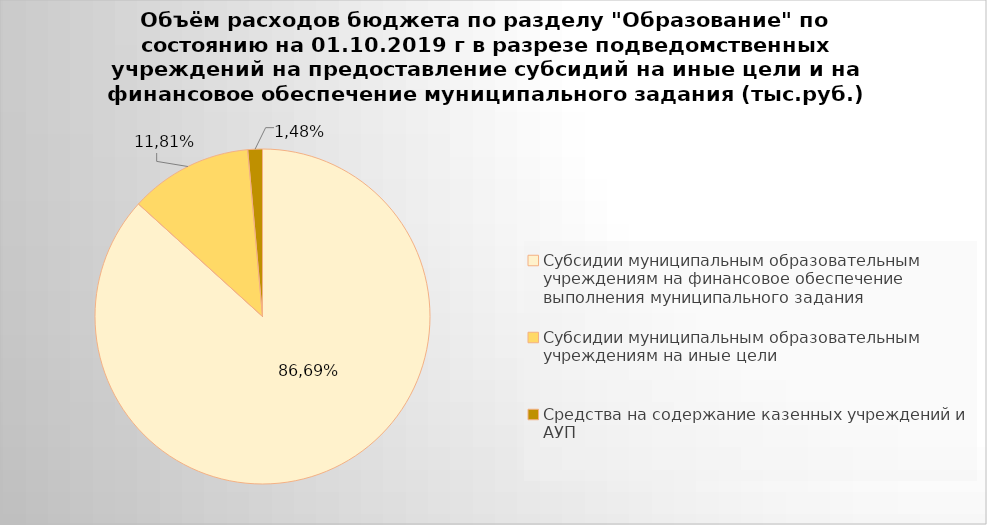
| Category | Series 0 |
|---|---|
| Субсидии муниципальным образовательным учреждениям на финансовое обеспечение выполнения муниципального задания | 4594483.22 |
| Субсидии муниципальным образовательным учреждениям на иные цели | 628924.85 |
| Средства на содержание казенных учреждений и АУП | 74683.1 |